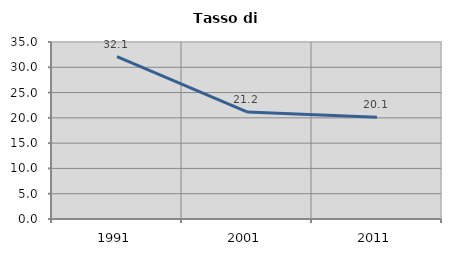
| Category | Tasso di disoccupazione   |
|---|---|
| 1991.0 | 32.098 |
| 2001.0 | 21.181 |
| 2011.0 | 20.106 |